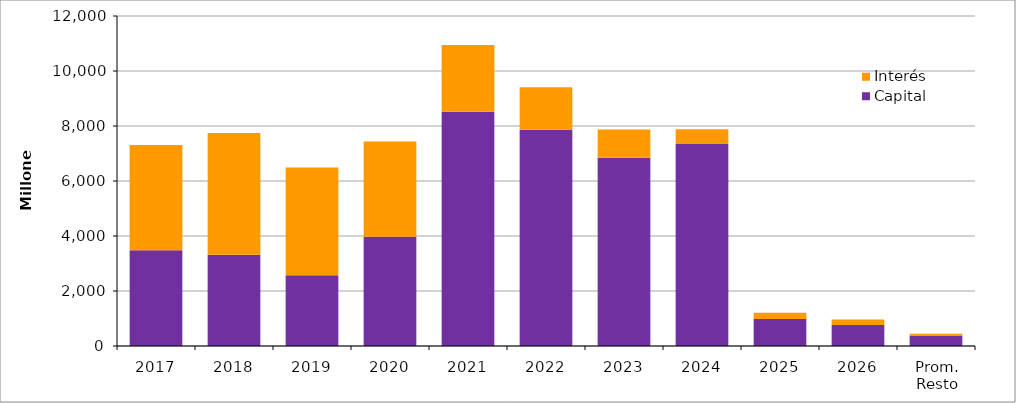
| Category | Capital | Interés |
|---|---|---|
| 2017 | 3480.354 | 3825.602 |
| 2018 | 3314.77 | 4433.908 |
| 2019 | 2570.166 | 3922.433 |
| 2020 | 3969.648 | 3464.255 |
| 2021 | 8514.484 | 2431.744 |
| 2022 | 7865.472 | 1542.194 |
| 2023 | 6841.517 | 1027.002 |
| 2024 | 7365.278 | 517.664 |
| 2025 | 982.175 | 223.626 |
| 2026 | 767.852 | 196.44 |
| Prom. Resto | 384.116 | 59.358 |